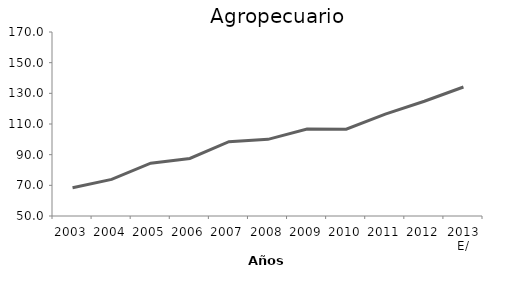
| Category | Agricultura, ganadería, aprovechamiento forestal, pesca y caza |
|---|---|
| 2003 | 68.401 |
| 2004 | 73.885 |
| 2005 | 84.433 |
| 2006 | 87.535 |
| 2007 | 98.459 |
| 2008 | 100 |
| 2009 | 106.784 |
| 2010 | 106.625 |
| 2011 | 116.466 |
| 2012 | 124.844 |
| 2013 E/ | 134.139 |